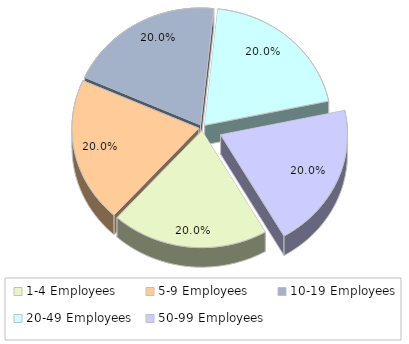
| Category | Series 0 |
|---|---|
| 1-4 Employees | 0.2 |
| 5-9 Employees | 0.2 |
| 10-19 Employees | 0.2 |
| 20-49 Employees | 0.2 |
| 50-99 Employees | 0.2 |